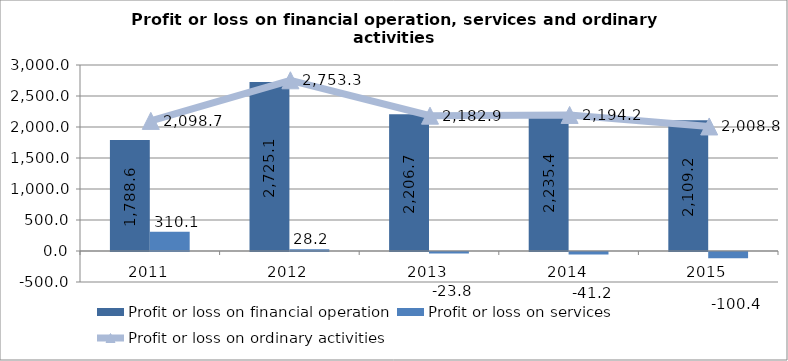
| Category | Profit or loss on financial operation | Profit or loss on services |
|---|---|---|
| 2011.0 | 1788.6 | 310.1 |
| 2012.0 | 2725.1 | 28.2 |
| 2013.0 | 2206.7 | -23.8 |
| 2014.0 | 2235.4 | -41.2 |
| 2015.0 | 2109.233 | -100.427 |